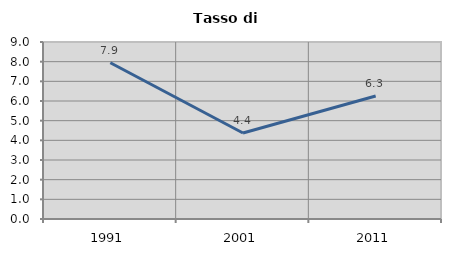
| Category | Tasso di disoccupazione   |
|---|---|
| 1991.0 | 7.946 |
| 2001.0 | 4.372 |
| 2011.0 | 6.256 |